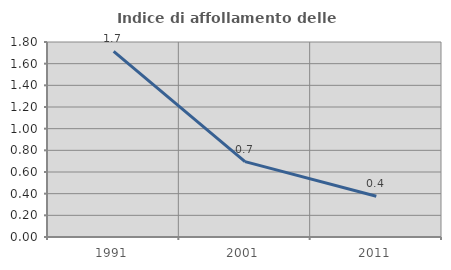
| Category | Indice di affollamento delle abitazioni  |
|---|---|
| 1991.0 | 1.714 |
| 2001.0 | 0.696 |
| 2011.0 | 0.377 |